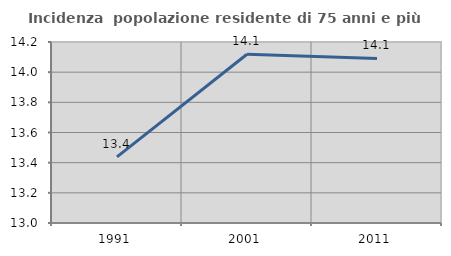
| Category | Incidenza  popolazione residente di 75 anni e più |
|---|---|
| 1991.0 | 13.438 |
| 2001.0 | 14.119 |
| 2011.0 | 14.091 |